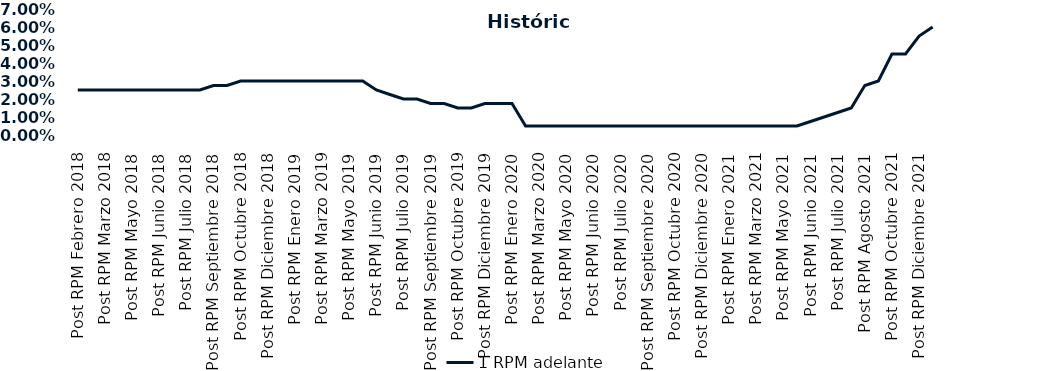
| Category | 1 RPM adelante |
|---|---|
| Post RPM Febrero 2018 | 0.025 |
| Pre RPM Marzo 2018 | 0.025 |
| Post RPM Marzo 2018 | 0.025 |
| Pre RPM Mayo 2018 | 0.025 |
| Post RPM Mayo 2018 | 0.025 |
| Pre RPM Junio 2018 | 0.025 |
| Post RPM Junio 2018 | 0.025 |
| Pre RPM Julio 2018 | 0.025 |
| Post RPM Julio 2018 | 0.025 |
| Pre RPM Septiembre 2018 | 0.025 |
| Post RPM Septiembre 2018 | 0.028 |
| Pre RPM Octubre 2018 | 0.028 |
| Post RPM Octubre 2018 | 0.03 |
| Pre RPM Diciembre 2018 | 0.03 |
| Post RPM Diciembre 2018 | 0.03 |
| Pre RPM Enero 2019 | 0.03 |
| Post RPM Enero 2019 | 0.03 |
| Pre RPM Marzo 2019 | 0.03 |
| Post RPM Marzo 2019 | 0.03 |
| Pre RPM Mayo 2019 | 0.03 |
| Post RPM Mayo 2019 | 0.03 |
| Pre RPM Junio 2019 | 0.03 |
| Post RPM Junio 2019 | 0.025 |
| Pre RPM Julio 2019 | 0.022 |
| Post RPM Julio 2019 | 0.02 |
| Pre RPM Septiembre 2019 | 0.02 |
| Post RPM Septiembre 2019 | 0.018 |
| Pre RPM Octubre 2019 | 0.018 |
| Post RPM Octubre 2019 | 0.015 |
| Pre RPM Diciembre 2019 | 0.015 |
| Post RPM Diciembre 2019 | 0.018 |
| Pre RPM Enero 2020 | 0.018 |
| Post RPM Enero 2020 | 0.018 |
| Pre RPM Marzo 2020 | 0.005 |
| Post RPM Marzo 2020 | 0.005 |
| Pre RPM Mayo 2020 | 0.005 |
| Post RPM Mayo 2020 | 0.005 |
| Pre RPM Junio 2020 | 0.005 |
| Post RPM Junio 2020 | 0.005 |
| Pre RPM Julio 2020 | 0.005 |
| Post RPM Julio 2020 | 0.005 |
| Pre RPM Septiembre 2020 | 0.005 |
| Post RPM Septiembre 2020 | 0.005 |
| Pre RPM Octubre 2020 | 0.005 |
| Post RPM Octubre 2020 | 0.005 |
| Pre RPM Diciembre 2020 | 0.005 |
| Post RPM Diciembre 2020 | 0.005 |
| Pre RPM Enero 2021 | 0.005 |
| Post RPM Enero 2021 | 0.005 |
| Pre RPM Marzo 2021 | 0.005 |
| Post RPM Marzo 2021 | 0.005 |
| Pre RPM Mayo 2021 | 0.005 |
| Post RPM Mayo 2021 | 0.005 |
| Pre RPM Junio 2021 | 0.005 |
| Post RPM Junio 2021 | 0.008 |
| Pre RPM Julio 2021 | 0.01 |
| Post RPM Julio 2021 | 0.012 |
| Pre RPM Agosto 2021 | 0.015 |
| Post RPM Agosto 2021 | 0.028 |
| Pre RPM Octubre 2021 | 0.03 |
| Post RPM Octubre 2021 | 0.045 |
| Pre RPM Diciembre 2021 | 0.045 |
| Post RPM Diciembre 2021 | 0.055 |
| Pre RPM Enero 2022 | 0.06 |